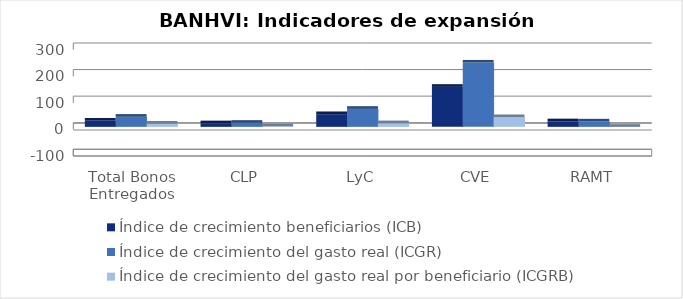
| Category | Índice de crecimiento beneficiarios (ICB)  | Índice de crecimiento del gasto real (ICGR)  | Índice de crecimiento del gasto real por beneficiario (ICGRB)  |
|---|---|---|---|
| Total Bonos Entregados | 23.222 | 37.861 | 11.88 |
| CLP | 13.244 | 15.081 | 1.622 |
| LyC | 47.736 | 67.633 | 13.468 |
| CVE | 150.485 | 241.661 | 36.4 |
| RAMT | 20.676 | 20.045 | -0.523 |